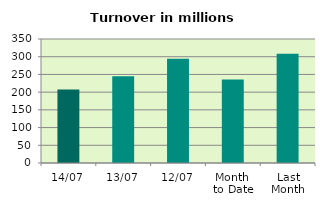
| Category | Series 0 |
|---|---|
| 14/07 | 207.396 |
| 13/07 | 244.578 |
| 12/07 | 294.517 |
| Month 
to Date | 235.373 |
| Last
Month | 308.534 |